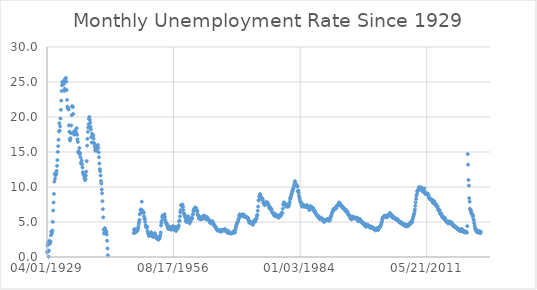
| Category | value |
|---|---|
| 10684.0 | 0.69 |
| 10714.0 | 1.65 |
| 10745.0 | 2.06 |
| 10775.0 | 0.79 |
| 10806.0 | 0.04 |
| 10837.0 | 0.91 |
| 10867.0 | 2.31 |
| 10898.0 | 1.89 |
| 10928.0 | 2.08 |
| 10959.0 | 2.21 |
| 10990.0 | 3.12 |
| 11018.0 | 3.63 |
| 11049.0 | 3.6 |
| 11079.0 | 3.39 |
| 11110.0 | 3.77 |
| 11140.0 | 5.02 |
| 11171.0 | 6.64 |
| 11202.0 | 7.79 |
| 11232.0 | 9.01 |
| 11263.0 | 10.78 |
| 11293.0 | 11.89 |
| 11324.0 | 11.18 |
| 11355.0 | 11.67 |
| 11383.0 | 11.78 |
| 11414.0 | 11.94 |
| 11444.0 | 12.3 |
| 11475.0 | 13.02 |
| 11505.0 | 13.84 |
| 11536.0 | 15.01 |
| 11567.0 | 15.83 |
| 11597.0 | 16.75 |
| 11628.0 | 17.95 |
| 11658.0 | 19.1 |
| 11689.0 | 18.04 |
| 11720.0 | 18.66 |
| 11749.0 | 19.78 |
| 11780.0 | 21.03 |
| 11810.0 | 22.34 |
| 11841.0 | 23.72 |
| 11871.0 | 24.54 |
| 11902.0 | 25.02 |
| 11933.0 | 24.85 |
| 11963.0 | 24.82 |
| 11994.0 | 24.67 |
| 12024.0 | 25.2 |
| 12055.0 | 23.72 |
| 12086.0 | 24.03 |
| 12114.0 | 25.36 |
| 12145.0 | 25.49 |
| 12175.0 | 25.59 |
| 12206.0 | 25.04 |
| 12236.0 | 23.84 |
| 12267.0 | 22.45 |
| 12298.0 | 21.48 |
| 12328.0 | 21.26 |
| 12359.0 | 21.29 |
| 12389.0 | 21.07 |
| 12420.0 | 18.8 |
| 12451.0 | 17.9 |
| 12479.0 | 16.81 |
| 12510.0 | 16.64 |
| 12540.0 | 16.96 |
| 12571.0 | 17.69 |
| 12601.0 | 18.79 |
| 12632.0 | 20.27 |
| 12663.0 | 21.51 |
| 12693.0 | 21.54 |
| 12724.0 | 21.41 |
| 12754.0 | 20.44 |
| 12785.0 | 17.88 |
| 12816.0 | 17.5 |
| 12844.0 | 17.54 |
| 12875.0 | 17.55 |
| 12905.0 | 17.77 |
| 12936.0 | 18.14 |
| 12966.0 | 17.72 |
| 12997.0 | 17.77 |
| 13028.0 | 18.41 |
| 13058.0 | 17.45 |
| 13089.0 | 16.8 |
| 13119.0 | 16.44 |
| 13150.0 | 14.96 |
| 13181.0 | 15.1 |
| 13210.0 | 14.86 |
| 13241.0 | 15.57 |
| 13271.0 | 14.67 |
| 13302.0 | 14.85 |
| 13332.0 | 14.25 |
| 13363.0 | 13.46 |
| 13394.0 | 13.31 |
| 13424.0 | 13.81 |
| 13455.0 | 13.24 |
| 13485.0 | 12.78 |
| 13516.0 | 12.11 |
| 13547.0 | 11.99 |
| 13575.0 | 11.73 |
| 13606.0 | 11.85 |
| 13636.0 | 11.23 |
| 13667.0 | 11.5 |
| 13697.0 | 10.97 |
| 13728.0 | 11.14 |
| 13759.0 | 11.63 |
| 13789.0 | 12.19 |
| 13820.0 | 13.7 |
| 13850.0 | 15.91 |
| 13881.0 | 16.88 |
| 13912.0 | 17.88 |
| 13940.0 | 18.49 |
| 13971.0 | 18.96 |
| 14001.0 | 19.74 |
| 14032.0 | 20 |
| 14062.0 | 19.58 |
| 14093.0 | 19.18 |
| 14124.0 | 18.6 |
| 14154.0 | 18.22 |
| 14185.0 | 17.14 |
| 14215.0 | 16.36 |
| 14246.0 | 17.61 |
| 14277.0 | 17.43 |
| 14305.0 | 17.19 |
| 14336.0 | 17.39 |
| 14366.0 | 16.9 |
| 14397.0 | 16.29 |
| 14427.0 | 16.18 |
| 14458.0 | 15.79 |
| 14489.0 | 15.22 |
| 14519.0 | 15.48 |
| 14550.0 | 15.49 |
| 14580.0 | 15.19 |
| 14611.0 | 15.53 |
| 14642.0 | 15.67 |
| 14671.0 | 15.66 |
| 14702.0 | 16 |
| 14732.0 | 15.57 |
| 14763.0 | 14.96 |
| 14793.0 | 14.24 |
| 14824.0 | 13.35 |
| 14855.0 | 12.55 |
| 14885.0 | 12.26 |
| 14916.0 | 11.65 |
| 14946.0 | 10.85 |
| 14977.0 | 10.49 |
| 15008.0 | 9.64 |
| 15036.0 | 9.1 |
| 15067.0 | 7.98 |
| 15097.0 | 6.84 |
| 15128.0 | 5.66 |
| 15158.0 | 3.88 |
| 15189.0 | 3.36 |
| 15220.0 | 3.43 |
| 15250.0 | 4.13 |
| 15281.0 | 3.93 |
| 15311.0 | 3.58 |
| 15342.0 | 3.72 |
| 15373.0 | 3.56 |
| 15401.0 | 3.22 |
| 15432.0 | 2.33 |
| 15462.0 | 1.22 |
| 15493.0 | 0.24 |
| 17533.0 | 3.4 |
| 17564.0 | 3.8 |
| 17593.0 | 4 |
| 17624.0 | 3.9 |
| 17654.0 | 3.5 |
| 17685.0 | 3.6 |
| 17715.0 | 3.6 |
| 17746.0 | 3.9 |
| 17777.0 | 3.8 |
| 17807.0 | 3.7 |
| 17838.0 | 3.8 |
| 17868.0 | 4 |
| 17899.0 | 4.3 |
| 17930.0 | 4.7 |
| 17958.0 | 5 |
| 17989.0 | 5.3 |
| 18019.0 | 6.1 |
| 18050.0 | 6.2 |
| 18080.0 | 6.7 |
| 18111.0 | 6.8 |
| 18142.0 | 6.6 |
| 18172.0 | 7.9 |
| 18203.0 | 6.4 |
| 18233.0 | 6.6 |
| 18264.0 | 6.5 |
| 18295.0 | 6.4 |
| 18323.0 | 6.3 |
| 18354.0 | 5.8 |
| 18384.0 | 5.5 |
| 18415.0 | 5.4 |
| 18445.0 | 5 |
| 18476.0 | 4.5 |
| 18507.0 | 4.4 |
| 18537.0 | 4.2 |
| 18568.0 | 4.2 |
| 18598.0 | 4.3 |
| 18629.0 | 3.7 |
| 18660.0 | 3.4 |
| 18688.0 | 3.4 |
| 18719.0 | 3.1 |
| 18749.0 | 3 |
| 18780.0 | 3.2 |
| 18810.0 | 3.1 |
| 18841.0 | 3.1 |
| 18872.0 | 3.3 |
| 18902.0 | 3.5 |
| 18933.0 | 3.5 |
| 18963.0 | 3.1 |
| 18994.0 | 3.2 |
| 19025.0 | 3.1 |
| 19054.0 | 2.9 |
| 19085.0 | 2.9 |
| 19115.0 | 3 |
| 19146.0 | 3 |
| 19176.0 | 3.2 |
| 19207.0 | 3.4 |
| 19238.0 | 3.1 |
| 19268.0 | 3 |
| 19299.0 | 2.8 |
| 19329.0 | 2.7 |
| 19360.0 | 2.9 |
| 19391.0 | 2.6 |
| 19419.0 | 2.6 |
| 19450.0 | 2.7 |
| 19480.0 | 2.5 |
| 19511.0 | 2.5 |
| 19541.0 | 2.6 |
| 19572.0 | 2.7 |
| 19603.0 | 2.9 |
| 19633.0 | 3.1 |
| 19664.0 | 3.5 |
| 19694.0 | 4.5 |
| 19725.0 | 4.9 |
| 19756.0 | 5.2 |
| 19784.0 | 5.7 |
| 19815.0 | 5.9 |
| 19845.0 | 5.9 |
| 19876.0 | 5.6 |
| 19906.0 | 5.8 |
| 19937.0 | 6 |
| 19968.0 | 6.1 |
| 19998.0 | 5.7 |
| 20029.0 | 5.3 |
| 20059.0 | 5 |
| 20090.0 | 4.9 |
| 20121.0 | 4.7 |
| 20149.0 | 4.6 |
| 20180.0 | 4.7 |
| 20210.0 | 4.3 |
| 20241.0 | 4.2 |
| 20271.0 | 4 |
| 20302.0 | 4.2 |
| 20333.0 | 4.1 |
| 20363.0 | 4.3 |
| 20394.0 | 4.2 |
| 20424.0 | 4.2 |
| 20455.0 | 4 |
| 20486.0 | 3.9 |
| 20515.0 | 4.2 |
| 20546.0 | 4 |
| 20576.0 | 4.3 |
| 20607.0 | 4.3 |
| 20637.0 | 4.4 |
| 20668.0 | 4.1 |
| 20699.0 | 3.9 |
| 20729.0 | 3.9 |
| 20760.0 | 4.3 |
| 20790.0 | 4.2 |
| 20821.0 | 4.2 |
| 20852.0 | 3.9 |
| 20880.0 | 3.7 |
| 20911.0 | 3.9 |
| 20941.0 | 4.1 |
| 20972.0 | 4.3 |
| 21002.0 | 4.2 |
| 21033.0 | 4.1 |
| 21064.0 | 4.4 |
| 21094.0 | 4.5 |
| 21125.0 | 5.1 |
| 21155.0 | 5.2 |
| 21186.0 | 5.8 |
| 21217.0 | 6.4 |
| 21245.0 | 6.7 |
| 21276.0 | 7.4 |
| 21306.0 | 7.4 |
| 21337.0 | 7.3 |
| 21367.0 | 7.5 |
| 21398.0 | 7.4 |
| 21429.0 | 7.1 |
| 21459.0 | 6.7 |
| 21490.0 | 6.2 |
| 21520.0 | 6.2 |
| 21551.0 | 6 |
| 21582.0 | 5.9 |
| 21610.0 | 5.6 |
| 21641.0 | 5.2 |
| 21671.0 | 5.1 |
| 21702.0 | 5 |
| 21732.0 | 5.1 |
| 21763.0 | 5.2 |
| 21794.0 | 5.5 |
| 21824.0 | 5.7 |
| 21855.0 | 5.8 |
| 21885.0 | 5.3 |
| 21916.0 | 5.2 |
| 21947.0 | 4.8 |
| 21976.0 | 5.4 |
| 22007.0 | 5.2 |
| 22037.0 | 5.1 |
| 22068.0 | 5.4 |
| 22098.0 | 5.5 |
| 22129.0 | 5.6 |
| 22160.0 | 5.5 |
| 22190.0 | 6.1 |
| 22221.0 | 6.1 |
| 22251.0 | 6.6 |
| 22282.0 | 6.6 |
| 22313.0 | 6.9 |
| 22341.0 | 6.9 |
| 22372.0 | 7 |
| 22402.0 | 7.1 |
| 22433.0 | 6.9 |
| 22463.0 | 7 |
| 22494.0 | 6.6 |
| 22525.0 | 6.7 |
| 22555.0 | 6.5 |
| 22586.0 | 6.1 |
| 22616.0 | 6 |
| 22647.0 | 5.8 |
| 22678.0 | 5.5 |
| 22706.0 | 5.6 |
| 22737.0 | 5.6 |
| 22767.0 | 5.5 |
| 22798.0 | 5.5 |
| 22828.0 | 5.4 |
| 22859.0 | 5.7 |
| 22890.0 | 5.6 |
| 22920.0 | 5.4 |
| 22951.0 | 5.7 |
| 22981.0 | 5.5 |
| 23012.0 | 5.7 |
| 23043.0 | 5.9 |
| 23071.0 | 5.7 |
| 23102.0 | 5.7 |
| 23132.0 | 5.9 |
| 23163.0 | 5.6 |
| 23193.0 | 5.6 |
| 23224.0 | 5.4 |
| 23255.0 | 5.5 |
| 23285.0 | 5.5 |
| 23316.0 | 5.7 |
| 23346.0 | 5.5 |
| 23377.0 | 5.6 |
| 23408.0 | 5.4 |
| 23437.0 | 5.4 |
| 23468.0 | 5.3 |
| 23498.0 | 5.1 |
| 23529.0 | 5.2 |
| 23559.0 | 4.9 |
| 23590.0 | 5 |
| 23621.0 | 5.1 |
| 23651.0 | 5.1 |
| 23682.0 | 4.8 |
| 23712.0 | 5 |
| 23743.0 | 4.9 |
| 23774.0 | 5.1 |
| 23802.0 | 4.7 |
| 23833.0 | 4.8 |
| 23863.0 | 4.6 |
| 23894.0 | 4.6 |
| 23924.0 | 4.4 |
| 23955.0 | 4.4 |
| 23986.0 | 4.3 |
| 24016.0 | 4.2 |
| 24047.0 | 4.1 |
| 24077.0 | 4 |
| 24108.0 | 4 |
| 24139.0 | 3.8 |
| 24167.0 | 3.8 |
| 24198.0 | 3.8 |
| 24228.0 | 3.9 |
| 24259.0 | 3.8 |
| 24289.0 | 3.8 |
| 24320.0 | 3.8 |
| 24351.0 | 3.7 |
| 24381.0 | 3.7 |
| 24412.0 | 3.6 |
| 24442.0 | 3.8 |
| 24473.0 | 3.9 |
| 24504.0 | 3.8 |
| 24532.0 | 3.8 |
| 24563.0 | 3.8 |
| 24593.0 | 3.8 |
| 24624.0 | 3.9 |
| 24654.0 | 3.8 |
| 24685.0 | 3.8 |
| 24716.0 | 3.8 |
| 24746.0 | 4 |
| 24777.0 | 3.9 |
| 24807.0 | 3.8 |
| 24838.0 | 3.7 |
| 24869.0 | 3.8 |
| 24898.0 | 3.7 |
| 24929.0 | 3.5 |
| 24959.0 | 3.5 |
| 24990.0 | 3.7 |
| 25020.0 | 3.7 |
| 25051.0 | 3.5 |
| 25082.0 | 3.4 |
| 25112.0 | 3.4 |
| 25143.0 | 3.4 |
| 25173.0 | 3.4 |
| 25204.0 | 3.4 |
| 25235.0 | 3.4 |
| 25263.0 | 3.4 |
| 25294.0 | 3.4 |
| 25324.0 | 3.4 |
| 25355.0 | 3.5 |
| 25385.0 | 3.5 |
| 25416.0 | 3.5 |
| 25447.0 | 3.7 |
| 25477.0 | 3.7 |
| 25508.0 | 3.5 |
| 25538.0 | 3.5 |
| 25569.0 | 3.9 |
| 25600.0 | 4.2 |
| 25628.0 | 4.4 |
| 25659.0 | 4.6 |
| 25689.0 | 4.8 |
| 25720.0 | 4.9 |
| 25750.0 | 5 |
| 25781.0 | 5.1 |
| 25812.0 | 5.4 |
| 25842.0 | 5.5 |
| 25873.0 | 5.9 |
| 25903.0 | 6.1 |
| 25934.0 | 5.9 |
| 25965.0 | 5.9 |
| 25993.0 | 6 |
| 26024.0 | 5.9 |
| 26054.0 | 5.9 |
| 26085.0 | 5.9 |
| 26115.0 | 6 |
| 26146.0 | 6.1 |
| 26177.0 | 6 |
| 26207.0 | 5.8 |
| 26238.0 | 6 |
| 26268.0 | 6 |
| 26299.0 | 5.8 |
| 26330.0 | 5.7 |
| 26359.0 | 5.8 |
| 26390.0 | 5.7 |
| 26420.0 | 5.7 |
| 26451.0 | 5.7 |
| 26481.0 | 5.6 |
| 26512.0 | 5.6 |
| 26543.0 | 5.5 |
| 26573.0 | 5.6 |
| 26604.0 | 5.3 |
| 26634.0 | 5.2 |
| 26665.0 | 4.9 |
| 26696.0 | 5 |
| 26724.0 | 4.9 |
| 26755.0 | 5 |
| 26785.0 | 4.9 |
| 26816.0 | 4.9 |
| 26846.0 | 4.8 |
| 26877.0 | 4.8 |
| 26908.0 | 4.8 |
| 26938.0 | 4.6 |
| 26969.0 | 4.8 |
| 26999.0 | 4.9 |
| 27030.0 | 5.1 |
| 27061.0 | 5.2 |
| 27089.0 | 5.1 |
| 27120.0 | 5.1 |
| 27150.0 | 5.1 |
| 27181.0 | 5.4 |
| 27211.0 | 5.5 |
| 27242.0 | 5.5 |
| 27273.0 | 5.9 |
| 27303.0 | 6 |
| 27334.0 | 6.6 |
| 27364.0 | 7.2 |
| 27395.0 | 8.1 |
| 27426.0 | 8.1 |
| 27454.0 | 8.6 |
| 27485.0 | 8.8 |
| 27515.0 | 9 |
| 27546.0 | 8.8 |
| 27576.0 | 8.6 |
| 27607.0 | 8.4 |
| 27638.0 | 8.4 |
| 27668.0 | 8.4 |
| 27699.0 | 8.3 |
| 27729.0 | 8.2 |
| 27760.0 | 7.9 |
| 27791.0 | 7.7 |
| 27820.0 | 7.6 |
| 27851.0 | 7.7 |
| 27881.0 | 7.4 |
| 27912.0 | 7.6 |
| 27942.0 | 7.8 |
| 27973.0 | 7.8 |
| 28004.0 | 7.6 |
| 28034.0 | 7.7 |
| 28065.0 | 7.8 |
| 28095.0 | 7.8 |
| 28126.0 | 7.5 |
| 28157.0 | 7.6 |
| 28185.0 | 7.4 |
| 28216.0 | 7.2 |
| 28246.0 | 7 |
| 28277.0 | 7.2 |
| 28307.0 | 6.9 |
| 28338.0 | 7 |
| 28369.0 | 6.8 |
| 28399.0 | 6.8 |
| 28430.0 | 6.8 |
| 28460.0 | 6.4 |
| 28491.0 | 6.4 |
| 28522.0 | 6.3 |
| 28550.0 | 6.3 |
| 28581.0 | 6.1 |
| 28611.0 | 6 |
| 28642.0 | 5.9 |
| 28672.0 | 6.2 |
| 28703.0 | 5.9 |
| 28734.0 | 6 |
| 28764.0 | 5.8 |
| 28795.0 | 5.9 |
| 28825.0 | 6 |
| 28856.0 | 5.9 |
| 28887.0 | 5.9 |
| 28915.0 | 5.8 |
| 28946.0 | 5.8 |
| 28976.0 | 5.6 |
| 29007.0 | 5.7 |
| 29037.0 | 5.7 |
| 29068.0 | 6 |
| 29099.0 | 5.9 |
| 29129.0 | 6 |
| 29160.0 | 5.9 |
| 29190.0 | 6 |
| 29221.0 | 6.3 |
| 29252.0 | 6.3 |
| 29281.0 | 6.3 |
| 29312.0 | 6.9 |
| 29342.0 | 7.5 |
| 29373.0 | 7.6 |
| 29403.0 | 7.8 |
| 29434.0 | 7.7 |
| 29465.0 | 7.5 |
| 29495.0 | 7.5 |
| 29526.0 | 7.5 |
| 29556.0 | 7.2 |
| 29587.0 | 7.5 |
| 29618.0 | 7.4 |
| 29646.0 | 7.4 |
| 29677.0 | 7.2 |
| 29707.0 | 7.5 |
| 29738.0 | 7.5 |
| 29768.0 | 7.2 |
| 29799.0 | 7.4 |
| 29830.0 | 7.6 |
| 29860.0 | 7.9 |
| 29891.0 | 8.3 |
| 29921.0 | 8.5 |
| 29952.0 | 8.6 |
| 29983.0 | 8.9 |
| 30011.0 | 9 |
| 30042.0 | 9.3 |
| 30072.0 | 9.4 |
| 30103.0 | 9.6 |
| 30133.0 | 9.8 |
| 30164.0 | 9.8 |
| 30195.0 | 10.1 |
| 30225.0 | 10.4 |
| 30256.0 | 10.8 |
| 30286.0 | 10.8 |
| 30317.0 | 10.4 |
| 30348.0 | 10.4 |
| 30376.0 | 10.3 |
| 30407.0 | 10.2 |
| 30437.0 | 10.1 |
| 30468.0 | 10.1 |
| 30498.0 | 9.4 |
| 30529.0 | 9.5 |
| 30560.0 | 9.2 |
| 30590.0 | 8.8 |
| 30621.0 | 8.5 |
| 30651.0 | 8.3 |
| 30682.0 | 8 |
| 30713.0 | 7.8 |
| 30742.0 | 7.8 |
| 30773.0 | 7.7 |
| 30803.0 | 7.4 |
| 30834.0 | 7.2 |
| 30864.0 | 7.5 |
| 30895.0 | 7.5 |
| 30926.0 | 7.3 |
| 30956.0 | 7.4 |
| 30987.0 | 7.2 |
| 31017.0 | 7.3 |
| 31048.0 | 7.3 |
| 31079.0 | 7.2 |
| 31107.0 | 7.2 |
| 31138.0 | 7.3 |
| 31168.0 | 7.2 |
| 31199.0 | 7.4 |
| 31229.0 | 7.4 |
| 31260.0 | 7.1 |
| 31291.0 | 7.1 |
| 31321.0 | 7.1 |
| 31352.0 | 7 |
| 31382.0 | 7 |
| 31413.0 | 6.7 |
| 31444.0 | 7.2 |
| 31472.0 | 7.2 |
| 31503.0 | 7.1 |
| 31533.0 | 7.2 |
| 31564.0 | 7.2 |
| 31594.0 | 7 |
| 31625.0 | 6.9 |
| 31656.0 | 7 |
| 31686.0 | 7 |
| 31717.0 | 6.9 |
| 31747.0 | 6.6 |
| 31778.0 | 6.6 |
| 31809.0 | 6.6 |
| 31837.0 | 6.6 |
| 31868.0 | 6.3 |
| 31898.0 | 6.3 |
| 31929.0 | 6.2 |
| 31959.0 | 6.1 |
| 31990.0 | 6 |
| 32021.0 | 5.9 |
| 32051.0 | 6 |
| 32082.0 | 5.8 |
| 32112.0 | 5.7 |
| 32143.0 | 5.7 |
| 32174.0 | 5.7 |
| 32203.0 | 5.7 |
| 32234.0 | 5.4 |
| 32264.0 | 5.6 |
| 32295.0 | 5.4 |
| 32325.0 | 5.4 |
| 32356.0 | 5.6 |
| 32387.0 | 5.4 |
| 32417.0 | 5.4 |
| 32448.0 | 5.3 |
| 32478.0 | 5.3 |
| 32509.0 | 5.4 |
| 32540.0 | 5.2 |
| 32568.0 | 5 |
| 32599.0 | 5.2 |
| 32629.0 | 5.2 |
| 32660.0 | 5.3 |
| 32690.0 | 5.2 |
| 32721.0 | 5.2 |
| 32752.0 | 5.3 |
| 32782.0 | 5.3 |
| 32813.0 | 5.4 |
| 32843.0 | 5.4 |
| 32874.0 | 5.4 |
| 32905.0 | 5.3 |
| 32933.0 | 5.2 |
| 32964.0 | 5.4 |
| 32994.0 | 5.4 |
| 33025.0 | 5.2 |
| 33055.0 | 5.5 |
| 33086.0 | 5.7 |
| 33117.0 | 5.9 |
| 33147.0 | 5.9 |
| 33178.0 | 6.2 |
| 33208.0 | 6.3 |
| 33239.0 | 6.4 |
| 33270.0 | 6.6 |
| 33298.0 | 6.8 |
| 33329.0 | 6.7 |
| 33359.0 | 6.9 |
| 33390.0 | 6.9 |
| 33420.0 | 6.8 |
| 33451.0 | 6.9 |
| 33482.0 | 6.9 |
| 33512.0 | 7 |
| 33543.0 | 7 |
| 33573.0 | 7.3 |
| 33604.0 | 7.3 |
| 33635.0 | 7.4 |
| 33664.0 | 7.4 |
| 33695.0 | 7.4 |
| 33725.0 | 7.6 |
| 33756.0 | 7.8 |
| 33786.0 | 7.7 |
| 33817.0 | 7.6 |
| 33848.0 | 7.6 |
| 33878.0 | 7.3 |
| 33909.0 | 7.4 |
| 33939.0 | 7.4 |
| 33970.0 | 7.3 |
| 34001.0 | 7.1 |
| 34029.0 | 7 |
| 34060.0 | 7.1 |
| 34090.0 | 7.1 |
| 34121.0 | 7 |
| 34151.0 | 6.9 |
| 34182.0 | 6.8 |
| 34213.0 | 6.7 |
| 34243.0 | 6.8 |
| 34274.0 | 6.6 |
| 34304.0 | 6.5 |
| 34335.0 | 6.6 |
| 34366.0 | 6.6 |
| 34394.0 | 6.5 |
| 34425.0 | 6.4 |
| 34455.0 | 6.1 |
| 34486.0 | 6.1 |
| 34516.0 | 6.1 |
| 34547.0 | 6 |
| 34578.0 | 5.9 |
| 34608.0 | 5.8 |
| 34639.0 | 5.6 |
| 34669.0 | 5.5 |
| 34700.0 | 5.6 |
| 34731.0 | 5.4 |
| 34759.0 | 5.4 |
| 34790.0 | 5.8 |
| 34820.0 | 5.6 |
| 34851.0 | 5.6 |
| 34881.0 | 5.7 |
| 34912.0 | 5.7 |
| 34943.0 | 5.6 |
| 34973.0 | 5.5 |
| 35004.0 | 5.6 |
| 35034.0 | 5.6 |
| 35065.0 | 5.6 |
| 35096.0 | 5.5 |
| 35125.0 | 5.5 |
| 35156.0 | 5.6 |
| 35186.0 | 5.6 |
| 35217.0 | 5.3 |
| 35247.0 | 5.5 |
| 35278.0 | 5.1 |
| 35309.0 | 5.2 |
| 35339.0 | 5.2 |
| 35370.0 | 5.4 |
| 35400.0 | 5.4 |
| 35431.0 | 5.3 |
| 35462.0 | 5.2 |
| 35490.0 | 5.2 |
| 35521.0 | 5.1 |
| 35551.0 | 4.9 |
| 35582.0 | 5 |
| 35612.0 | 4.9 |
| 35643.0 | 4.8 |
| 35674.0 | 4.9 |
| 35704.0 | 4.7 |
| 35735.0 | 4.6 |
| 35765.0 | 4.7 |
| 35796.0 | 4.6 |
| 35827.0 | 4.6 |
| 35855.0 | 4.7 |
| 35886.0 | 4.3 |
| 35916.0 | 4.4 |
| 35947.0 | 4.5 |
| 35977.0 | 4.5 |
| 36008.0 | 4.5 |
| 36039.0 | 4.6 |
| 36069.0 | 4.5 |
| 36100.0 | 4.4 |
| 36130.0 | 4.4 |
| 36161.0 | 4.3 |
| 36192.0 | 4.4 |
| 36220.0 | 4.2 |
| 36251.0 | 4.3 |
| 36281.0 | 4.2 |
| 36312.0 | 4.3 |
| 36342.0 | 4.3 |
| 36373.0 | 4.2 |
| 36404.0 | 4.2 |
| 36434.0 | 4.1 |
| 36465.0 | 4.1 |
| 36495.0 | 4 |
| 36526.0 | 4 |
| 36557.0 | 4.1 |
| 36586.0 | 4 |
| 36617.0 | 3.8 |
| 36647.0 | 4 |
| 36678.0 | 4 |
| 36708.0 | 4 |
| 36739.0 | 4.1 |
| 36770.0 | 3.9 |
| 36800.0 | 3.9 |
| 36831.0 | 3.9 |
| 36861.0 | 3.9 |
| 36892.0 | 4.2 |
| 36923.0 | 4.2 |
| 36951.0 | 4.3 |
| 36982.0 | 4.4 |
| 37012.0 | 4.3 |
| 37043.0 | 4.5 |
| 37073.0 | 4.6 |
| 37104.0 | 4.9 |
| 37135.0 | 5 |
| 37165.0 | 5.3 |
| 37196.0 | 5.5 |
| 37226.0 | 5.7 |
| 37257.0 | 5.7 |
| 37288.0 | 5.7 |
| 37316.0 | 5.7 |
| 37347.0 | 5.9 |
| 37377.0 | 5.8 |
| 37408.0 | 5.8 |
| 37438.0 | 5.8 |
| 37469.0 | 5.7 |
| 37500.0 | 5.7 |
| 37530.0 | 5.7 |
| 37561.0 | 5.9 |
| 37591.0 | 6 |
| 37622.0 | 5.8 |
| 37653.0 | 5.9 |
| 37681.0 | 5.9 |
| 37712.0 | 6 |
| 37742.0 | 6.1 |
| 37773.0 | 6.3 |
| 37803.0 | 6.2 |
| 37834.0 | 6.1 |
| 37865.0 | 6.1 |
| 37895.0 | 6 |
| 37926.0 | 5.8 |
| 37956.0 | 5.7 |
| 37987.0 | 5.7 |
| 38018.0 | 5.6 |
| 38047.0 | 5.8 |
| 38078.0 | 5.6 |
| 38108.0 | 5.6 |
| 38139.0 | 5.6 |
| 38169.0 | 5.5 |
| 38200.0 | 5.4 |
| 38231.0 | 5.4 |
| 38261.0 | 5.5 |
| 38292.0 | 5.4 |
| 38322.0 | 5.4 |
| 38353.0 | 5.3 |
| 38384.0 | 5.4 |
| 38412.0 | 5.2 |
| 38443.0 | 5.2 |
| 38473.0 | 5.1 |
| 38504.0 | 5 |
| 38534.0 | 5 |
| 38565.0 | 4.9 |
| 38596.0 | 5 |
| 38626.0 | 5 |
| 38657.0 | 5 |
| 38687.0 | 4.9 |
| 38718.0 | 4.7 |
| 38749.0 | 4.8 |
| 38777.0 | 4.7 |
| 38808.0 | 4.7 |
| 38838.0 | 4.6 |
| 38869.0 | 4.6 |
| 38899.0 | 4.7 |
| 38930.0 | 4.7 |
| 38961.0 | 4.5 |
| 38991.0 | 4.4 |
| 39022.0 | 4.5 |
| 39052.0 | 4.4 |
| 39083.0 | 4.6 |
| 39114.0 | 4.5 |
| 39142.0 | 4.4 |
| 39173.0 | 4.5 |
| 39203.0 | 4.4 |
| 39234.0 | 4.6 |
| 39264.0 | 4.7 |
| 39295.0 | 4.6 |
| 39326.0 | 4.7 |
| 39356.0 | 4.7 |
| 39387.0 | 4.7 |
| 39417.0 | 5 |
| 39448.0 | 5 |
| 39479.0 | 4.9 |
| 39508.0 | 5.1 |
| 39539.0 | 5 |
| 39569.0 | 5.4 |
| 39600.0 | 5.6 |
| 39630.0 | 5.8 |
| 39661.0 | 6.1 |
| 39692.0 | 6.1 |
| 39722.0 | 6.5 |
| 39753.0 | 6.8 |
| 39783.0 | 7.3 |
| 39814.0 | 7.8 |
| 39845.0 | 8.3 |
| 39873.0 | 8.7 |
| 39904.0 | 9 |
| 39934.0 | 9.4 |
| 39965.0 | 9.5 |
| 39995.0 | 9.5 |
| 40026.0 | 9.6 |
| 40057.0 | 9.8 |
| 40087.0 | 10 |
| 40118.0 | 9.9 |
| 40148.0 | 9.9 |
| 40179.0 | 9.8 |
| 40210.0 | 9.8 |
| 40238.0 | 9.9 |
| 40269.0 | 9.9 |
| 40299.0 | 9.6 |
| 40330.0 | 9.4 |
| 40360.0 | 9.4 |
| 40391.0 | 9.5 |
| 40422.0 | 9.5 |
| 40452.0 | 9.4 |
| 40483.0 | 9.8 |
| 40513.0 | 9.3 |
| 40544.0 | 9.1 |
| 40575.0 | 9 |
| 40603.0 | 9 |
| 40634.0 | 9.1 |
| 40664.0 | 9 |
| 40695.0 | 9.1 |
| 40725.0 | 9 |
| 40756.0 | 9 |
| 40787.0 | 9 |
| 40817.0 | 8.8 |
| 40848.0 | 8.6 |
| 40878.0 | 8.5 |
| 40909.0 | 8.3 |
| 40940.0 | 8.3 |
| 40969.0 | 8.2 |
| 41000.0 | 8.2 |
| 41030.0 | 8.2 |
| 41061.0 | 8.2 |
| 41091.0 | 8.2 |
| 41122.0 | 8.1 |
| 41153.0 | 7.8 |
| 41183.0 | 7.8 |
| 41214.0 | 7.7 |
| 41244.0 | 7.9 |
| 41275.0 | 8 |
| 41306.0 | 7.7 |
| 41334.0 | 7.5 |
| 41365.0 | 7.6 |
| 41395.0 | 7.5 |
| 41426.0 | 7.5 |
| 41456.0 | 7.3 |
| 41487.0 | 7.2 |
| 41518.0 | 7.2 |
| 41548.0 | 7.2 |
| 41579.0 | 6.9 |
| 41609.0 | 6.7 |
| 41640.0 | 6.6 |
| 41671.0 | 6.7 |
| 41699.0 | 6.7 |
| 41730.0 | 6.2 |
| 41760.0 | 6.3 |
| 41791.0 | 6.1 |
| 41821.0 | 6.2 |
| 41852.0 | 6.1 |
| 41883.0 | 5.9 |
| 41913.0 | 5.7 |
| 41944.0 | 5.8 |
| 41974.0 | 5.6 |
| 42005.0 | 5.7 |
| 42036.0 | 5.5 |
| 42064.0 | 5.4 |
| 42095.0 | 5.4 |
| 42125.0 | 5.6 |
| 42156.0 | 5.3 |
| 42186.0 | 5.2 |
| 42217.0 | 5.1 |
| 42248.0 | 5 |
| 42278.0 | 5 |
| 42309.0 | 5.1 |
| 42339.0 | 5 |
| 42370.0 | 4.8 |
| 42401.0 | 4.9 |
| 42430.0 | 5 |
| 42461.0 | 5.1 |
| 42491.0 | 4.8 |
| 42522.0 | 4.9 |
| 42552.0 | 4.8 |
| 42583.0 | 4.9 |
| 42614.0 | 5 |
| 42644.0 | 4.9 |
| 42675.0 | 4.7 |
| 42705.0 | 4.7 |
| 42736.0 | 4.7 |
| 42767.0 | 4.6 |
| 42795.0 | 4.4 |
| 42826.0 | 4.4 |
| 42856.0 | 4.4 |
| 42887.0 | 4.3 |
| 42917.0 | 4.3 |
| 42948.0 | 4.4 |
| 42979.0 | 4.3 |
| 43009.0 | 4.2 |
| 43040.0 | 4.2 |
| 43070.0 | 4.1 |
| 43101.0 | 4 |
| 43132.0 | 4.1 |
| 43160.0 | 4 |
| 43191.0 | 4 |
| 43221.0 | 3.8 |
| 43252.0 | 4 |
| 43282.0 | 3.8 |
| 43313.0 | 3.8 |
| 43344.0 | 3.7 |
| 43374.0 | 3.8 |
| 43405.0 | 3.8 |
| 43435.0 | 3.9 |
| 43466.0 | 4 |
| 43497.0 | 3.8 |
| 43525.0 | 3.8 |
| 43556.0 | 3.6 |
| 43586.0 | 3.6 |
| 43617.0 | 3.6 |
| 43647.0 | 3.7 |
| 43678.0 | 3.7 |
| 43709.0 | 3.5 |
| 43739.0 | 3.6 |
| 43770.0 | 3.6 |
| 43800.0 | 3.6 |
| 43831.0 | 3.5 |
| 43862.0 | 3.5 |
| 43891.0 | 4.4 |
| 43922.0 | 14.7 |
| 43952.0 | 13.2 |
| 43983.0 | 11 |
| 44013.0 | 10.2 |
| 44044.0 | 8.4 |
| 44075.0 | 7.9 |
| 44105.0 | 6.9 |
| 44136.0 | 6.7 |
| 44166.0 | 6.7 |
| 44197.0 | 6.4 |
| 44228.0 | 6.2 |
| 44256.0 | 6.1 |
| 44287.0 | 6.1 |
| 44317.0 | 5.8 |
| 44348.0 | 5.9 |
| 44378.0 | 5.4 |
| 44409.0 | 5.2 |
| 44440.0 | 4.8 |
| 44470.0 | 4.5 |
| 44501.0 | 4.2 |
| 44531.0 | 3.9 |
| 44562.0 | 4 |
| 44593.0 | 3.8 |
| 44621.0 | 3.6 |
| 44652.0 | 3.6 |
| 44682.0 | 3.6 |
| 44713.0 | 3.6 |
| 44743.0 | 3.5 |
| 44774.0 | 3.7 |
| 44805.0 | 3.5 |
| 44835.0 | 3.7 |
| 44866.0 | 3.6 |
| 44896.0 | 3.5 |
| 44927.0 | 3.4 |
| 44958.0 | 3.6 |